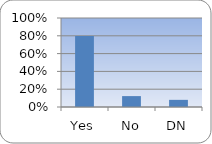
| Category | Series 0 |
|---|---|
| Yes | 0.797 |
| No | 0.122 |
| DN | 0.08 |